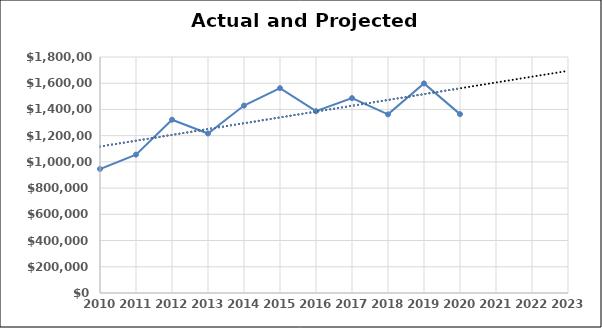
| Category | Series 0 |
|---|---|
| 2010.0 | 946000 |
| 2011.0 | 1055600 |
| 2012.0 | 1321800 |
| 2013.0 | 1216500 |
| 2014.0 | 1429500 |
| 2015.0 | 1562540 |
| 2016.0 | 1386540 |
| 2017.0 | 1486550 |
| 2018.0 | 1362500 |
| 2019.0 | 1598650 |
| 2020.0 | 1364290 |